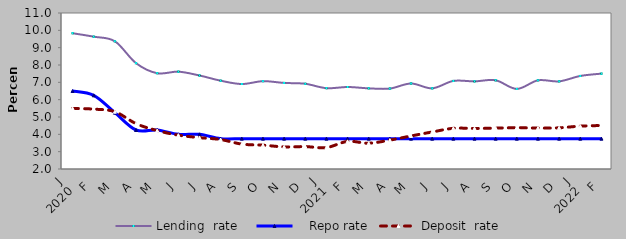
| Category | Lending  |    Repo rate | Deposit  |
|---|---|---|---|
| 0 | 9.833 | 6.5 | 5.497 |
| 1900-01-01 | 9.634 | 6.25 | 5.454 |
| 1900-01-02 | 9.369 | 5.25 | 5.304 |
| 1900-01-03 | 8.106 | 4.25 | 4.617 |
| 1900-01-04 | 7.526 | 4.25 | 4.216 |
| 1900-01-05 | 7.616 | 4 | 3.953 |
| 1900-01-06 | 7.394 | 4 | 3.809 |
| 1900-01-07 | 7.095 | 3.75 | 3.699 |
| 1900-01-08 | 6.902 | 3.75 | 3.437 |
| 1900-01-09 | 7.067 | 3.75 | 3.374 |
| 1900-01-10 | 6.965 | 3.75 | 3.276 |
| 1900-01-11 | 6.917 | 3.75 | 3.292 |
| 1900-01-12 | 6.663 | 3.75 | 3.236 |
| 1900-01-13 | 6.731 | 3.75 | 3.592 |
| 1900-01-14 | 6.653 | 3.75 | 3.488 |
| 1900-01-15 | 6.64 | 3.75 | 3.667 |
| 1900-01-16 | 6.933 | 3.75 | 3.907 |
| 1900-01-17 | 6.654 | 3.75 | 4.137 |
| 1900-01-18 | 7.081 | 3.75 | 4.347 |
| 1900-01-19 | 7.055 | 3.75 | 4.341 |
| 1900-01-20 | 7.118 | 3.75 | 4.357 |
| 1900-01-21 | 6.62 | 3.75 | 4.386 |
| 1900-01-22 | 7.116 | 3.75 | 4.36 |
| 1900-01-23 | 7.056 | 3.75 | 4.377 |
| 1900-01-24 | 7.368 | 3.75 | 4.473 |
| 1900-01-25 | 7.502 | 3.75 | 4.51 |